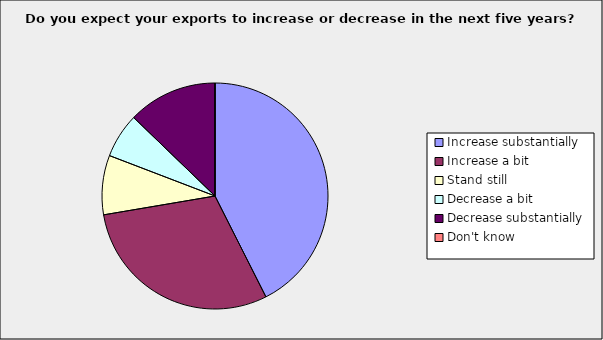
| Category | Series 0 |
|---|---|
| Increase substantially | 0.426 |
| Increase a bit  | 0.298 |
| Stand still  | 0.085 |
| Decrease a bit  | 0.064 |
| Decrease substantially  | 0.128 |
| Don't know | 0 |